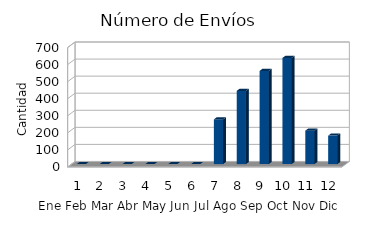
| Category | Series 0 |
|---|---|
| 0 | 0 |
| 1 | 0 |
| 2 | 0 |
| 3 | 0 |
| 4 | 0 |
| 5 | 0 |
| 6 | 262 |
| 7 | 429 |
| 8 | 546 |
| 9 | 622 |
| 10 | 196 |
| 11 | 167 |